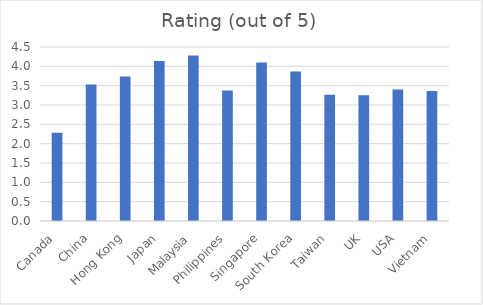
| Category | Rating (out of 5) |
|---|---|
| Canada | 2.281 |
| China | 3.528 |
| Hong Kong | 3.735 |
| Japan | 4.14 |
| Malaysia | 4.281 |
| Philippines | 3.375 |
| Singapore | 4.096 |
| South Korea | 3.866 |
| Taiwan | 3.264 |
| UK | 3.25 |
| USA | 3.4 |
| Vietnam | 3.362 |